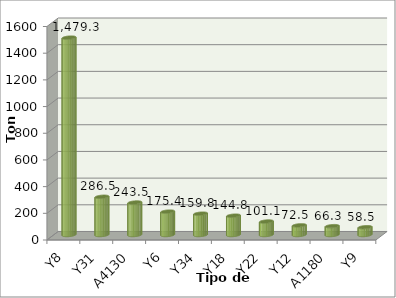
| Category | Series 0 |
|---|---|
| Y8 | 1479.315 |
| Y31 | 286.478 |
| A4130 | 243.507 |
| Y6 | 175.354 |
| Y34 | 159.839 |
| Y18 | 144.793 |
| Y22 | 101.127 |
| Y12 | 72.462 |
| A1180 | 66.344 |
| Y9 | 58.527 |